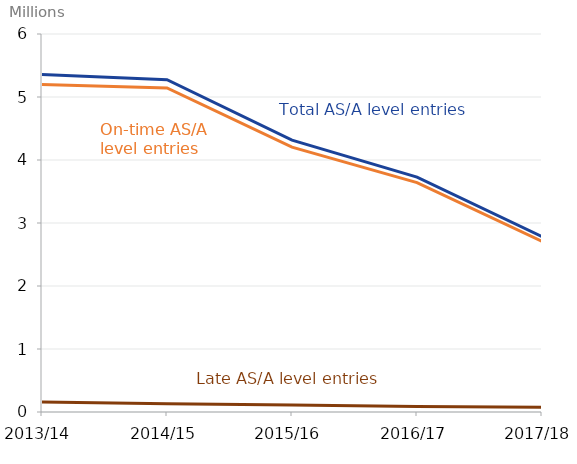
| Category | Total Entries | On-time entries | Late entries |
|---|---|---|---|
| 2013/14 | 5355730 | 5198735 | 157000 |
| 2014/15 | 5275300 | 5144725 | 130575 |
| 2015/16 | 4314960 | 4203715 | 111245 |
| 2016/17 | 3727450 | 3641350 | 86100 |
| 2017/18 | 2783730 | 2707900 | 75830 |